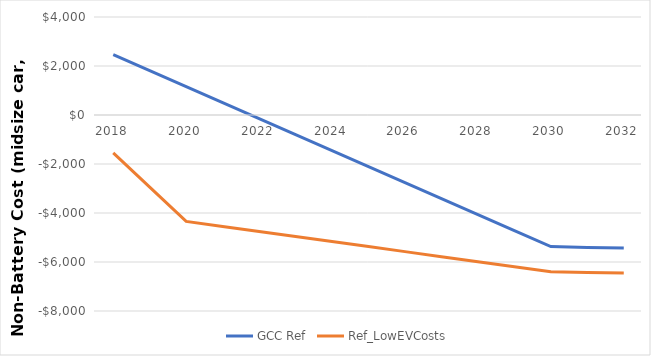
| Category | GCC Ref | Ref_LowEVCosts |
|---|---|---|
| 2018.0 | 2462.231 | -1549.278 |
| 2019.0 | 1809.462 | -2945.639 |
| 2020.0 | 1156.692 | -4342 |
| 2021.0 | 503.923 | -4547.8 |
| 2022.0 | -148.846 | -4753.6 |
| 2023.0 | -801.615 | -4959.4 |
| 2024.0 | -1454.385 | -5165.2 |
| 2025.0 | -2107.154 | -5371 |
| 2026.0 | -2759.923 | -5576.8 |
| 2027.0 | -3412.692 | -5782.6 |
| 2028.0 | -4065.462 | -5988.4 |
| 2029.0 | -4718.231 | -6194.2 |
| 2030.0 | -5371 | -6400 |
| 2031.0 | -5406.463 | -6428.689 |
| 2032.0 | -5432.807 | -6450 |